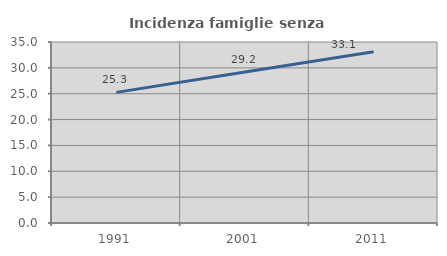
| Category | Incidenza famiglie senza nuclei |
|---|---|
| 1991.0 | 25.26 |
| 2001.0 | 29.19 |
| 2011.0 | 33.119 |